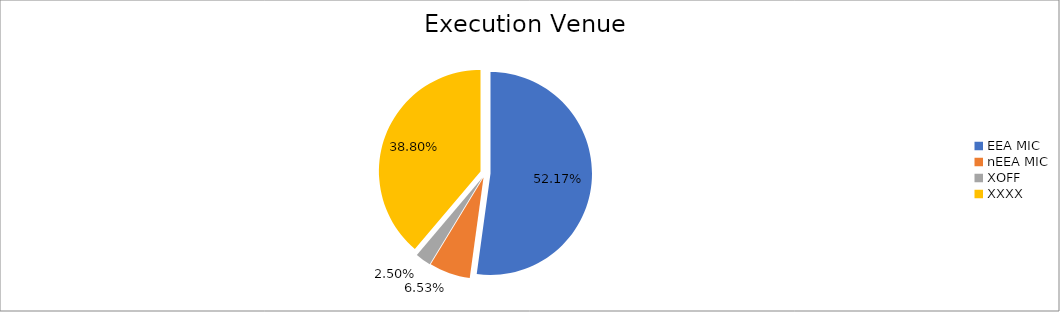
| Category | Series 0 |
|---|---|
| EEA MIC | 5902977.005 |
| nEEA MIC | 739365.724 |
| XOFF | 282340.509 |
| XXXX | 4391018.005 |